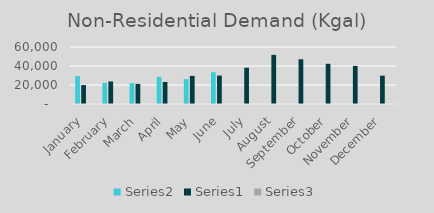
| Category | Series 1 | Series 0 | Series 2 |
|---|---|---|---|
| January | 29345 | 19908 | 1.474 |
| February | 22317.599 | 23745 | 0.94 |
| March | 21887.421 | 21154 | 1.035 |
| April | 28601.111 | 23203.745 | 1.233 |
| May | 26182.77 | 29574.268 | 0.885 |
| June | 33454.234 | 29931.133 | 1.118 |
| July | 0 | 38220.373 | 0 |
| August | 0 | 51691.008 | 0 |
| September | 0 | 47078.323 | 0 |
| October | 0 | 42320.849 | 0 |
| November | 0 | 40123.835 | 0 |
| December | 0 | 29804.055 | 0 |